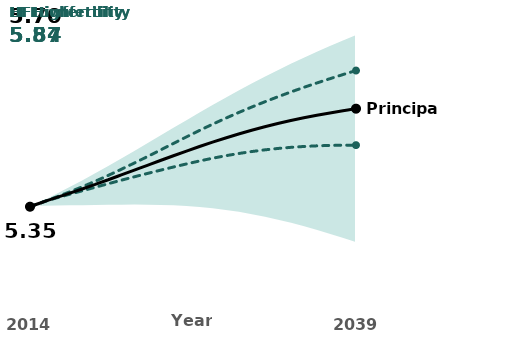
| Category | HF |
|---|---|
| 2014.0 | 5.348 |
| 2015.0 | 5.365 |
| 2016.0 | 5.382 |
| 2017.0 | 5.4 |
| 2018.0 | 5.419 |
| 2019.0 | 5.439 |
| 2020.0 | 5.461 |
| 2021.0 | 5.483 |
| 2022.0 | 5.505 |
| 2023.0 | 5.528 |
| 2024.0 | 5.552 |
| 2025.0 | 5.576 |
| 2026.0 | 5.6 |
| 2027.0 | 5.623 |
| 2028.0 | 5.645 |
| 2029.0 | 5.667 |
| 2030.0 | 5.688 |
| 2031.0 | 5.707 |
| 2032.0 | 5.726 |
| 2033.0 | 5.744 |
| 2034.0 | 5.762 |
| 2035.0 | 5.778 |
| 2036.0 | 5.794 |
| 2037.0 | 5.81 |
| 2038.0 | 5.825 |
| 2039.0 | 5.839 |